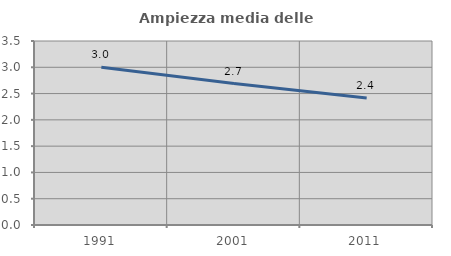
| Category | Ampiezza media delle famiglie |
|---|---|
| 1991.0 | 3.002 |
| 2001.0 | 2.69 |
| 2011.0 | 2.414 |